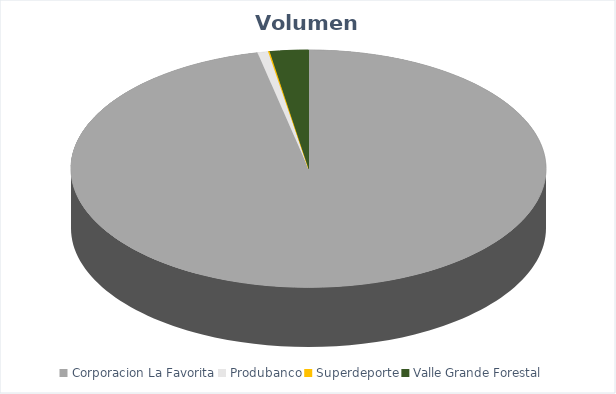
| Category | VOLUMEN ($USD) |
|---|---|
| Corporacion La Favorita | 191519.09 |
| Produbanco | 1446.2 |
| Superdeporte | 199.65 |
| Valle Grande Forestal | 5189.6 |